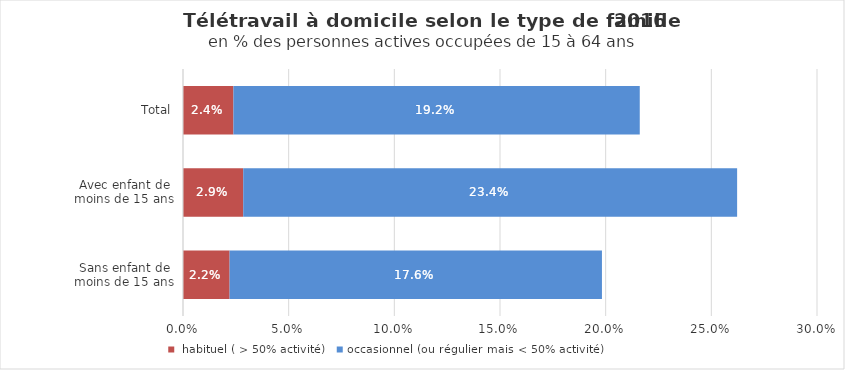
| Category |  habituel ( > 50% activité) | occasionnel (ou régulier mais < 50% activité) |
|---|---|---|
| Sans enfant de moins de 15 ans | 0.022 | 0.176 |
| Avec enfant de moins de 15 ans | 0.029 | 0.234 |
| Total | 0.024 | 0.192 |